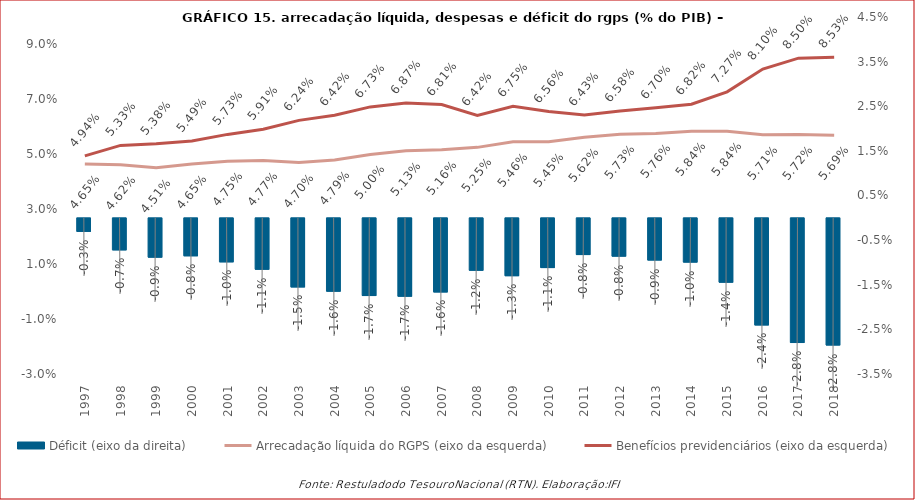
| Category | Déficit (eixo da direita) |
|---|---|
| 1997 | -0.003 |
| 1998 | -0.007 |
| 1999 | -0.009 |
| 2000 | -0.008 |
| 2001 | -0.01 |
| 2002 | -0.011 |
| 2003 | -0.015 |
| 2004 | -0.016 |
| 2005 | -0.017 |
| 2006 | -0.017 |
| 2007 | -0.016 |
| 2008 | -0.012 |
| 2009 | -0.013 |
| 2010 | -0.011 |
| 2011 | -0.008 |
| 2012 | -0.008 |
| 2013 | -0.009 |
| 2014 | -0.01 |
| 2015 | -0.014 |
| 2016 | -0.024 |
| 2017 | -0.028 |
| 2018 | -0.028 |